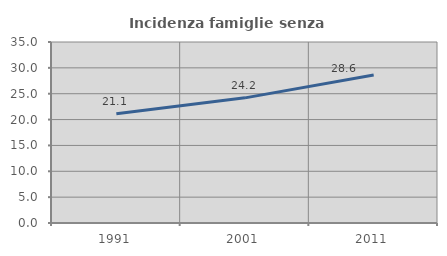
| Category | Incidenza famiglie senza nuclei |
|---|---|
| 1991.0 | 21.146 |
| 2001.0 | 24.199 |
| 2011.0 | 28.599 |